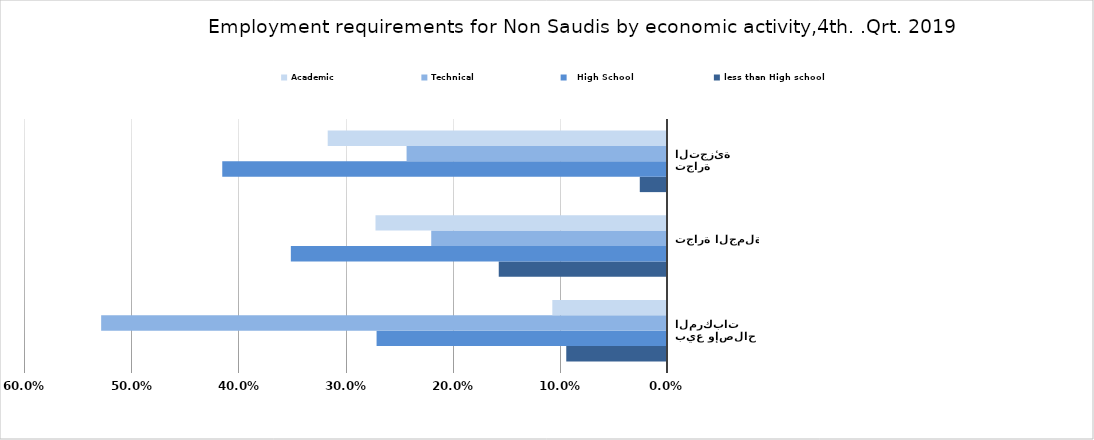
| Category | less than High school |   High School | Technical | Academic |
|---|---|---|---|---|
| بيع وإصلاح المركبات  | 0.094 | 0.271 | 0.528 | 0.107 |
| تجارة الجملة | 0.157 | 0.351 | 0.22 | 0.272 |
| تجارة التجزئة | 0.025 | 0.415 | 0.243 | 0.317 |